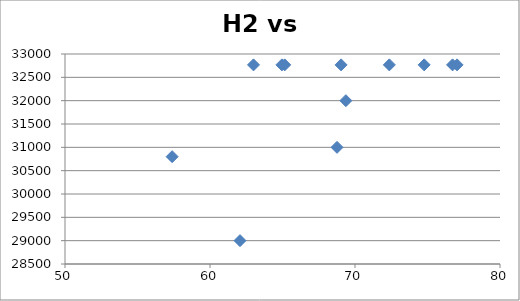
| Category | Series 0 |
|---|---|
| 76.73 | 32767 |
| 57.39 | 30800 |
| 74.77 | 32767 |
| 69.04 | 32767 |
| 65.15 | 32767 |
| 77.04 | 32767 |
| 63.0 | 32767 |
| 64.96 | 32767 |
| 69.37 | 32000 |
| 72.37 | 32767 |
| 62.07 | 29000 |
| 68.76 | 31000 |